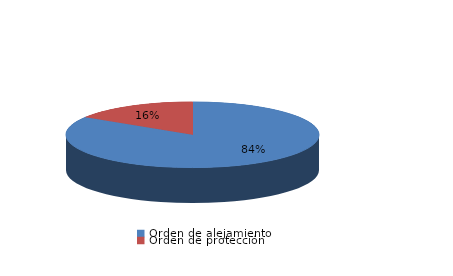
| Category | Series 0 |
|---|---|
| Orden de alejamiento | 21 |
| Orden de protección | 4 |